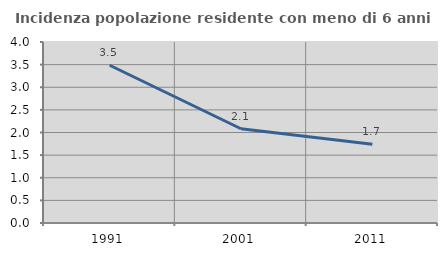
| Category | Incidenza popolazione residente con meno di 6 anni |
|---|---|
| 1991.0 | 3.487 |
| 2001.0 | 2.083 |
| 2011.0 | 1.739 |